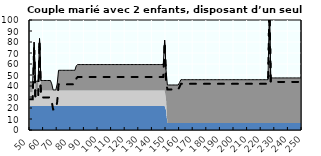
| Category | Coin fiscal marginal (somme des composantes) | Taux d’imposition marginal net |
|---|---|---|
| 50.0 | 43.661 | 27.909 |
| 51.0 | 43.661 | 27.909 |
| 52.0 | 43.661 | 27.909 |
| 53.0 | 79.863 | 74.233 |
| 54.0 | 44.331 | 28.767 |
| 55.0 | 44.331 | 28.767 |
| 56.0 | 44.331 | 28.767 |
| 57.0 | 83.215 | 78.522 |
| 58.0 | 45.001 | 29.625 |
| 59.0 | 45.001 | 29.625 |
| 60.0 | 45.001 | 29.625 |
| 61.0 | 45.001 | 29.625 |
| 62.0 | 45.001 | 29.625 |
| 63.0 | 45.001 | 29.625 |
| 64.0 | 45.001 | 29.625 |
| 65.0 | 45.001 | 29.625 |
| 66.0 | 41.929 | 25.693 |
| 67.0 | 36.454 | 18.688 |
| 68.0 | 36.454 | 18.688 |
| 69.0 | 36.454 | 18.688 |
| 70.0 | 41.825 | 25.56 |
| 71.0 | 54.28 | 41.497 |
| 72.0 | 54.28 | 41.497 |
| 73.0 | 54.28 | 41.497 |
| 74.0 | 54.28 | 41.497 |
| 75.0 | 54.28 | 41.497 |
| 76.0 | 54.28 | 41.497 |
| 77.0 | 54.28 | 41.497 |
| 78.0 | 54.28 | 41.497 |
| 79.0 | 54.28 | 41.497 |
| 80.0 | 54.28 | 41.497 |
| 81.0 | 54.28 | 41.497 |
| 82.0 | 54.28 | 41.497 |
| 83.0 | 54.28 | 41.497 |
| 84.0 | 58.313 | 46.658 |
| 85.0 | 59.49 | 48.164 |
| 86.0 | 59.49 | 48.164 |
| 87.0 | 59.49 | 48.164 |
| 88.0 | 59.49 | 48.164 |
| 89.0 | 59.49 | 48.164 |
| 90.0 | 59.49 | 48.164 |
| 91.0 | 59.49 | 48.164 |
| 92.0 | 59.49 | 48.164 |
| 93.0 | 59.49 | 48.164 |
| 94.0 | 59.49 | 48.164 |
| 95.0 | 59.49 | 48.164 |
| 96.0 | 59.49 | 48.164 |
| 97.0 | 59.49 | 48.164 |
| 98.0 | 59.49 | 48.164 |
| 99.0 | 59.49 | 48.164 |
| 100.0 | 59.49 | 48.164 |
| 101.0 | 59.49 | 48.164 |
| 102.0 | 59.49 | 48.164 |
| 103.0 | 59.49 | 48.164 |
| 104.0 | 59.49 | 48.164 |
| 105.0 | 59.49 | 48.164 |
| 106.0 | 59.49 | 48.164 |
| 107.0 | 59.49 | 48.164 |
| 108.0 | 59.49 | 48.164 |
| 109.0 | 59.49 | 48.164 |
| 110.0 | 59.49 | 48.164 |
| 111.0 | 59.49 | 48.164 |
| 112.0 | 59.49 | 48.164 |
| 113.0 | 59.49 | 48.164 |
| 114.0 | 59.49 | 48.164 |
| 115.0 | 59.49 | 48.164 |
| 116.0 | 59.49 | 48.164 |
| 117.0 | 59.49 | 48.164 |
| 118.0 | 59.49 | 48.164 |
| 119.0 | 59.49 | 48.164 |
| 120.0 | 59.49 | 48.164 |
| 121.0 | 59.49 | 48.164 |
| 122.0 | 59.49 | 48.164 |
| 123.0 | 59.49 | 48.164 |
| 124.0 | 59.49 | 48.164 |
| 125.0 | 59.49 | 48.164 |
| 126.0 | 59.49 | 48.164 |
| 127.0 | 59.49 | 48.164 |
| 128.0 | 59.49 | 48.164 |
| 129.0 | 59.49 | 48.164 |
| 130.0 | 59.49 | 48.164 |
| 131.0 | 59.49 | 48.164 |
| 132.0 | 59.49 | 48.164 |
| 133.0 | 59.49 | 48.164 |
| 134.0 | 59.49 | 48.164 |
| 135.0 | 59.49 | 48.164 |
| 136.0 | 59.49 | 48.164 |
| 137.0 | 59.49 | 48.164 |
| 138.0 | 59.49 | 48.164 |
| 139.0 | 59.49 | 48.164 |
| 140.0 | 59.49 | 48.164 |
| 141.0 | 59.49 | 48.164 |
| 142.0 | 59.49 | 48.164 |
| 143.0 | 59.49 | 48.164 |
| 144.0 | 59.49 | 48.164 |
| 145.0 | 59.49 | 48.164 |
| 146.0 | 59.49 | 48.164 |
| 147.0 | 59.49 | 48.164 |
| 148.0 | 59.49 | 48.164 |
| 149.0 | 81.749 | 76.646 |
| 150.0 | 54.998 | 45.037 |
| 151.0 | 40.933 | 36.857 |
| 152.0 | 40.933 | 36.857 |
| 153.0 | 40.933 | 36.857 |
| 154.0 | 40.933 | 36.857 |
| 155.0 | 40.933 | 36.857 |
| 156.0 | 40.933 | 36.857 |
| 157.0 | 40.933 | 36.857 |
| 158.0 | 40.933 | 36.857 |
| 159.0 | 40.933 | 36.857 |
| 160.0 | 43.258 | 39.343 |
| 161.0 | 45.744 | 42 |
| 162.0 | 45.744 | 42 |
| 163.0 | 45.744 | 42 |
| 164.0 | 45.744 | 42 |
| 165.0 | 45.744 | 42 |
| 166.0 | 45.744 | 42 |
| 167.0 | 45.744 | 42 |
| 168.0 | 45.744 | 42 |
| 169.0 | 45.744 | 42 |
| 170.0 | 45.744 | 42 |
| 171.0 | 45.744 | 42 |
| 172.0 | 45.744 | 42 |
| 173.0 | 45.744 | 42 |
| 174.0 | 45.744 | 42 |
| 175.0 | 45.744 | 42 |
| 176.0 | 45.744 | 42 |
| 177.0 | 45.744 | 42 |
| 178.0 | 45.744 | 42 |
| 179.0 | 45.744 | 42 |
| 180.0 | 45.744 | 42 |
| 181.0 | 45.744 | 42 |
| 182.0 | 45.744 | 42 |
| 183.0 | 45.744 | 42 |
| 184.0 | 45.744 | 42 |
| 185.0 | 45.744 | 42 |
| 186.0 | 45.744 | 42 |
| 187.0 | 45.744 | 42 |
| 188.0 | 45.744 | 42 |
| 189.0 | 45.744 | 42 |
| 190.0 | 45.744 | 42 |
| 191.0 | 45.744 | 42 |
| 192.0 | 45.744 | 42 |
| 193.0 | 45.744 | 42 |
| 194.0 | 45.744 | 42 |
| 195.0 | 45.744 | 42 |
| 196.0 | 45.744 | 42 |
| 197.0 | 45.744 | 42 |
| 198.0 | 45.744 | 42 |
| 199.0 | 45.744 | 42 |
| 200.0 | 45.744 | 42 |
| 201.0 | 45.744 | 42 |
| 202.0 | 45.744 | 42 |
| 203.0 | 45.744 | 42 |
| 204.0 | 45.744 | 42 |
| 205.0 | 45.744 | 42 |
| 206.0 | 45.744 | 42 |
| 207.0 | 45.744 | 42 |
| 208.0 | 45.744 | 42 |
| 209.0 | 45.744 | 42 |
| 210.0 | 45.744 | 42 |
| 211.0 | 45.744 | 42 |
| 212.0 | 45.744 | 42 |
| 213.0 | 45.744 | 42 |
| 214.0 | 45.744 | 42 |
| 215.0 | 45.744 | 42 |
| 216.0 | 45.744 | 42 |
| 217.0 | 45.744 | 42 |
| 218.0 | 45.744 | 42 |
| 219.0 | 45.744 | 42 |
| 220.0 | 45.744 | 42 |
| 221.0 | 45.744 | 42 |
| 222.0 | 45.744 | 42 |
| 223.0 | 45.744 | 42 |
| 224.0 | 45.744 | 42 |
| 225.0 | 45.744 | 42 |
| 226.0 | 112.394 | 113.249 |
| 227.0 | 47.347 | 43.714 |
| 228.0 | 47.347 | 43.714 |
| 229.0 | 47.347 | 43.714 |
| 230.0 | 47.347 | 43.714 |
| 231.0 | 47.347 | 43.714 |
| 232.0 | 47.347 | 43.714 |
| 233.0 | 47.347 | 43.714 |
| 234.0 | 47.347 | 43.714 |
| 235.0 | 47.347 | 43.714 |
| 236.0 | 47.347 | 43.714 |
| 237.0 | 47.347 | 43.714 |
| 238.0 | 47.347 | 43.714 |
| 239.0 | 47.347 | 43.714 |
| 240.0 | 47.347 | 43.714 |
| 241.0 | 47.347 | 43.714 |
| 242.0 | 47.347 | 43.714 |
| 243.0 | 47.347 | 43.714 |
| 244.0 | 47.347 | 43.714 |
| 245.0 | 47.347 | 43.714 |
| 246.0 | 47.347 | 43.714 |
| 247.0 | 47.347 | 43.714 |
| 248.0 | 47.347 | 43.714 |
| 249.0 | 47.347 | 43.714 |
| 250.0 | 47.347 | 43.714 |